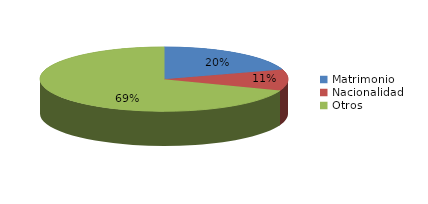
| Category | Series 0 |
|---|---|
| Matrimonio | 553 |
| Nacionalidad | 289 |
| Otros | 1894 |